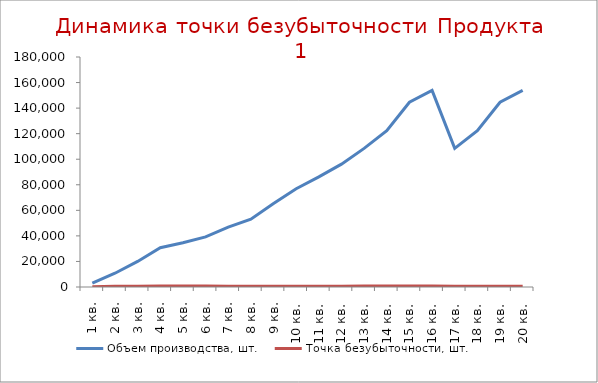
| Category | Объем производства, шт. | Точка безубыточности, шт. |
|---|---|---|
| 1 кв. | 3076.923 | 222.854 |
| 2 кв. | 10769.231 | 502.242 |
| 3 кв. | 20000 | 639.344 |
| 4 кв. | 30769.231 | 781.126 |
| 5 кв. | 34615.385 | 828.142 |
| 6 кв. | 39230.769 | 757.467 |
| 7 кв. | 46923.077 | 651.321 |
| 8 кв. | 53076.923 | 600.615 |
| 9 кв. | 65384.615 | 619.069 |
| 10 кв. | 76923.077 | 625.343 |
| 11 кв. | 86153.846 | 668.122 |
| 12 кв. | 96153.846 | 674.388 |
| 13 кв. | 108461.538 | 705.708 |
| 14 кв. | 122307.692 | 743.903 |
| 15 кв. | 144615.385 | 815.289 |
| 16 кв. | 153846.154 | 790.537 |
| 17 кв. | 108461.538 | 570.354 |
| 18 кв. | 122307.692 | 596.52 |
| 19 кв. | 144615.385 | 651.229 |
| 20 кв. | 153846.154 | 647.541 |